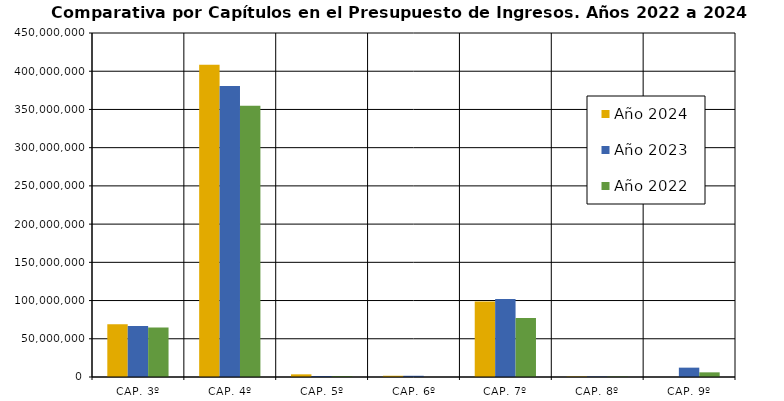
| Category | Año 2024 | Año 2023 | Año 2022 |
|---|---|---|---|
| CAP. 3º | 68944890 | 66628296.17 | 64830025 |
| CAP. 4º | 408590871 | 380692905.71 | 354755067.898 |
| CAP. 5º | 3490000 | 1279600 | 1206320 |
| CAP. 6º | 1636330 | 1615330 | 0 |
| CAP. 7º | 98664031 | 102135446.531 | 77236214.78 |
| CAP. 8º | 650000 | 650000 | 650000 |
| CAP. 9º | 0 | 12231060.8 | 6093440 |